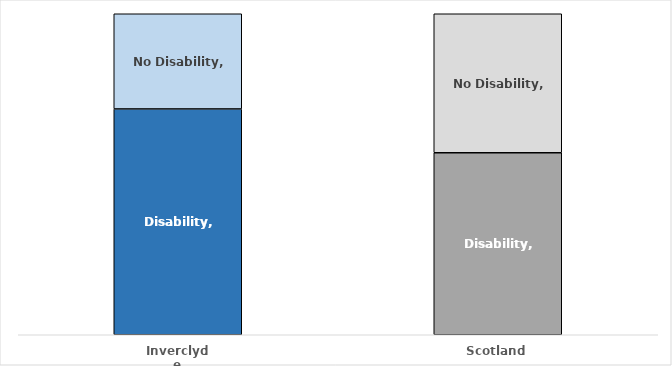
| Category | Disability | No Disability |
|---|---|---|
| Inverclyde | 0.703 | 0.297 |
| Scotland | 0.567 | 0.433 |